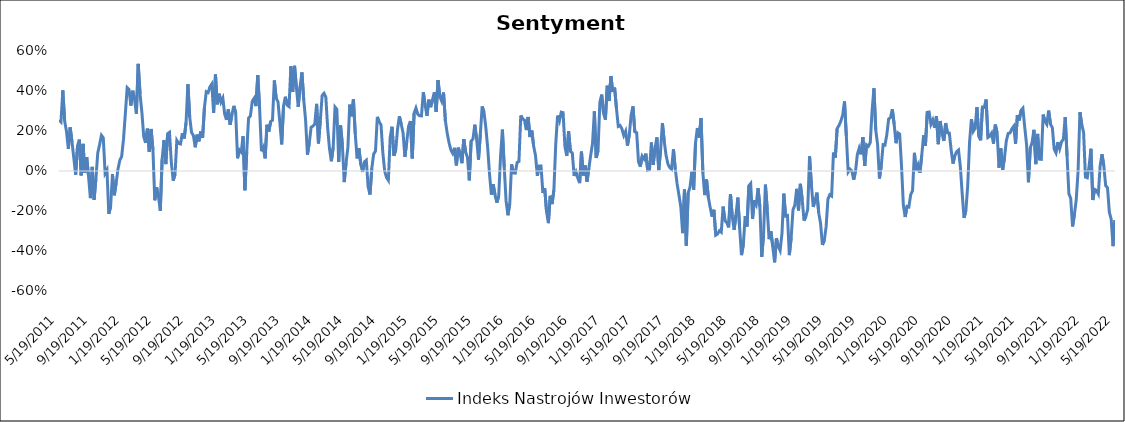
| Category | Indeks Nastrojów Inwestorów |
|---|---|
| 5/19/11 | 0.255 |
| 5/26/11 | 0.245 |
| 6/2/11 | 0.403 |
| 6/9/11 | 0.25 |
| 6/16/11 | 0.199 |
| 6/23/11 | 0.11 |
| 6/30/11 | 0.218 |
| 7/7/11 | 0.145 |
| 7/14/11 | 0.063 |
| 7/21/11 | -0.019 |
| 7/28/11 | 0.125 |
| 8/4/11 | 0.157 |
| 8/11/11 | -0.022 |
| 8/18/11 | 0.136 |
| 8/25/11 | -0.008 |
| 9/1/11 | 0.07 |
| 9/8/11 | -0.028 |
| 9/15/11 | -0.136 |
| 9/22/11 | 0.02 |
| 9/29/11 | -0.144 |
| 10/6/11 | -0.038 |
| 10/13/11 | 0.09 |
| 10/20/11 | 0.132 |
| 10/27/11 | 0.179 |
| 11/3/11 | 0.167 |
| 11/10/11 | -0.012 |
| 11/17/11 | 0.005 |
| 11/24/11 | -0.214 |
| 12/1/11 | -0.177 |
| 12/8/11 | -0.016 |
| 12/15/11 | -0.121 |
| 12/22/11 | -0.06 |
| 12/29/11 | 0.01 |
| 1/5/12 | 0.054 |
| 1/12/12 | 0.073 |
| 1/19/12 | 0.159 |
| 1/26/12 | 0.287 |
| 2/2/12 | 0.417 |
| 2/9/12 | 0.408 |
| 2/16/12 | 0.327 |
| 2/23/12 | 0.402 |
| 3/1/12 | 0.357 |
| 3/8/12 | 0.287 |
| 3/15/12 | 0.536 |
| 3/22/12 | 0.384 |
| 3/29/12 | 0.294 |
| 4/5/12 | 0.172 |
| 4/12/12 | 0.141 |
| 4/19/12 | 0.212 |
| 4/26/12 | 0.096 |
| 5/3/12 | 0.21 |
| 5/10/12 | 0.107 |
| 5/17/12 | -0.146 |
| 5/24/12 | -0.081 |
| 5/31/12 | -0.128 |
| 6/7/12 | -0.198 |
| 6/14/12 | 0.058 |
| 6/21/12 | 0.154 |
| 6/28/12 | 0.034 |
| 7/5/12 | 0.187 |
| 7/12/12 | 0.193 |
| 7/19/12 | 0.042 |
| 7/26/12 | -0.048 |
| 8/2/12 | -0.017 |
| 8/9/12 | 0.153 |
| 8/16/12 | 0.138 |
| 8/23/12 | 0.135 |
| 8/30/12 | 0.189 |
| 9/6/12 | 0.163 |
| 9/13/12 | 0.241 |
| 9/20/12 | 0.434 |
| 9/27/12 | 0.27 |
| 10/4/12 | 0.193 |
| 10/11/12 | 0.177 |
| 10/18/12 | 0.119 |
| 10/25/12 | 0.182 |
| 11/1/12 | 0.148 |
| 11/8/12 | 0.198 |
| 11/15/12 | 0.166 |
| 11/22/12 | 0.317 |
| 11/29/12 | 0.396 |
| 12/6/12 | 0.392 |
| 12/13/12 | 0.421 |
| 12/20/12 | 0.435 |
| 12/27/12 | 0.29 |
| 1/3/13 | 0.482 |
| 1/10/13 | 0.333 |
| 1/17/13 | 0.386 |
| 1/24/13 | 0.344 |
| 1/31/13 | 0.365 |
| 2/7/13 | 0.285 |
| 2/14/13 | 0.256 |
| 2/21/13 | 0.308 |
| 2/28/13 | 0.231 |
| 3/7/13 | 0.285 |
| 3/14/13 | 0.326 |
| 3/21/13 | 0.29 |
| 3/28/13 | 0.063 |
| 4/4/13 | 0.105 |
| 4/11/13 | 0.094 |
| 4/18/13 | 0.174 |
| 4/25/13 | -0.096 |
| 5/2/13 | 0.097 |
| 5/9/13 | 0.264 |
| 5/16/13 | 0.276 |
| 5/23/13 | 0.349 |
| 5/30/13 | 0.364 |
| 6/6/13 | 0.324 |
| 6/13/13 | 0.48 |
| 6/20/13 | 0.313 |
| 6/27/13 | 0.099 |
| 7/4/13 | 0.118 |
| 7/11/13 | 0.063 |
| 7/18/13 | 0.231 |
| 7/25/13 | 0.197 |
| 8/1/13 | 0.247 |
| 8/8/13 | 0.254 |
| 8/15/13 | 0.453 |
| 8/22/13 | 0.364 |
| 8/29/13 | 0.346 |
| 9/5/13 | 0.243 |
| 9/12/13 | 0.133 |
| 9/19/13 | 0.326 |
| 9/26/13 | 0.371 |
| 10/3/13 | 0.329 |
| 10/10/13 | 0.322 |
| 10/17/13 | 0.523 |
| 10/24/13 | 0.396 |
| 10/31/13 | 0.526 |
| 11/7/13 | 0.418 |
| 11/14/13 | 0.321 |
| 11/21/13 | 0.422 |
| 11/28/13 | 0.493 |
| 12/5/13 | 0.355 |
| 12/12/13 | 0.255 |
| 12/19/13 | 0.081 |
| 12/26/13 | 0.14 |
| 1/2/14 | 0.219 |
| 1/9/14 | 0.224 |
| 1/16/14 | 0.234 |
| 1/23/14 | 0.336 |
| 1/30/14 | 0.138 |
| 2/6/14 | 0.253 |
| 2/13/14 | 0.377 |
| 2/20/14 | 0.388 |
| 2/27/14 | 0.37 |
| 3/6/14 | 0.215 |
| 3/13/14 | 0.112 |
| 3/20/14 | 0.049 |
| 3/27/14 | 0.118 |
| 4/3/14 | 0.32 |
| 4/10/14 | 0.309 |
| 4/17/14 | 0.045 |
| 4/24/14 | 0.229 |
| 5/1/14 | 0.131 |
| 5/8/14 | -0.055 |
| 5/15/14 | 0.04 |
| 5/22/14 | 0.118 |
| 5/29/14 | 0.332 |
| 6/5/14 | 0.273 |
| 6/12/14 | 0.358 |
| 6/19/14 | 0.186 |
| 6/26/14 | 0.063 |
| 7/3/14 | 0.114 |
| 7/10/14 | 0.033 |
| 7/17/14 | -0.005 |
| 7/24/14 | 0.046 |
| 7/31/14 | 0.054 |
| 8/7/14 | -0.079 |
| 8/14/14 | -0.118 |
| 8/21/14 | 0.013 |
| 8/28/14 | 0.085 |
| 9/4/14 | 0.1 |
| 9/11/14 | 0.271 |
| 9/18/14 | 0.245 |
| 9/25/14 | 0.231 |
| 10/2/14 | 0.092 |
| 10/9/14 | 0 |
| 10/16/14 | -0.033 |
| 10/23/14 | -0.047 |
| 10/30/14 | 0.169 |
| 11/6/14 | 0.221 |
| 11/13/14 | 0.076 |
| 11/20/14 | 0.104 |
| 11/27/14 | 0.209 |
| 12/4/14 | 0.274 |
| 12/11/14 | 0.233 |
| 12/18/14 | 0.19 |
| 12/25/14 | 0.07 |
| 1/1/15 | 0.147 |
| 1/8/15 | 0.224 |
| 1/15/15 | 0.25 |
| 1/22/15 | 0.063 |
| 1/29/15 | 0.289 |
| 2/5/15 | 0.315 |
| 2/12/15 | 0.284 |
| 2/19/15 | 0.276 |
| 2/26/15 | 0.276 |
| 3/5/15 | 0.394 |
| 3/12/15 | 0.329 |
| 3/19/15 | 0.276 |
| 3/26/15 | 0.357 |
| 4/2/15 | 0.319 |
| 4/9/15 | 0.357 |
| 4/16/15 | 0.394 |
| 4/23/15 | 0.295 |
| 4/30/15 | 0.454 |
| 5/7/15 | 0.372 |
| 5/14/15 | 0.349 |
| 5/21/15 | 0.393 |
| 5/28/15 | 0.252 |
| 6/4/15 | 0.188 |
| 6/11/15 | 0.141 |
| 6/18/15 | 0.105 |
| 6/25/15 | 0.088 |
| 7/2/15 | 0.116 |
| 7/9/15 | 0.028 |
| 7/16/15 | 0.117 |
| 7/23/15 | 0.087 |
| 7/30/15 | 0.039 |
| 8/6/15 | 0.159 |
| 8/13/15 | 0.095 |
| 8/20/15 | 0.068 |
| 8/27/15 | -0.047 |
| 9/3/15 | 0.15 |
| 9/10/15 | 0.16 |
| 9/17/15 | 0.231 |
| 9/24/15 | 0.159 |
| 10/1/15 | 0.057 |
| 10/8/15 | 0.183 |
| 10/15/15 | 0.323 |
| 10/22/15 | 0.294 |
| 10/29/15 | 0.217 |
| 11/5/15 | 0.116 |
| 11/12/15 | -0.015 |
| 11/19/15 | -0.118 |
| 11/26/15 | -0.066 |
| 12/3/15 | -0.12 |
| 12/10/15 | -0.159 |
| 12/17/15 | -0.125 |
| 12/24/15 | 0.074 |
| 12/31/15 | 0.207 |
| 1/7/16 | 0.02 |
| 1/14/16 | -0.149 |
| 1/21/16 | -0.221 |
| 1/28/16 | -0.164 |
| 2/4/16 | 0.033 |
| 2/11/16 | -0.01 |
| 2/18/16 | -0.011 |
| 2/25/16 | 0.043 |
| 3/3/16 | 0.048 |
| 3/10/16 | 0.278 |
| 3/17/16 | 0.259 |
| 3/24/16 | 0.255 |
| 3/31/16 | 0.205 |
| 4/7/16 | 0.27 |
| 4/14/16 | 0.17 |
| 4/21/16 | 0.203 |
| 4/28/16 | 0.124 |
| 5/5/16 | 0.078 |
| 5/12/16 | -0.024 |
| 5/19/16 | 0.025 |
| 5/26/16 | 0.025 |
| 6/2/16 | -0.109 |
| 6/9/16 | -0.087 |
| 6/16/16 | -0.202 |
| 6/23/16 | -0.261 |
| 6/30/16 | -0.124 |
| 7/7/16 | -0.165 |
| 7/14/16 | -0.094 |
| 7/21/16 | 0.135 |
| 7/28/16 | 0.277 |
| 8/4/16 | 0.25 |
| 8/11/16 | 0.294 |
| 8/18/16 | 0.292 |
| 8/25/16 | 0.122 |
| 9/1/16 | 0.075 |
| 9/8/16 | 0.198 |
| 9/15/16 | 0.098 |
| 9/22/16 | 0.09 |
| 9/29/16 | -0.024 |
| 10/6/16 | -0.004 |
| 10/13/16 | -0.035 |
| 10/20/16 | -0.06 |
| 10/27/16 | 0.097 |
| 11/3/16 | -0.023 |
| 11/10/16 | 0.028 |
| 11/17/16 | -0.054 |
| 11/24/16 | 0.013 |
| 12/1/16 | 0.078 |
| 12/8/16 | 0.137 |
| 12/15/16 | 0.298 |
| 12/22/16 | 0.065 |
| 12/29/16 | 0.102 |
| 1/5/17 | 0.344 |
| 1/12/17 | 0.382 |
| 1/19/17 | 0.289 |
| 1/26/17 | 0.257 |
| 2/2/17 | 0.426 |
| 2/9/17 | 0.35 |
| 2/16/17 | 0.475 |
| 2/23/17 | 0.396 |
| 3/2/17 | 0.417 |
| 3/9/17 | 0.315 |
| 3/16/17 | 0.223 |
| 3/23/17 | 0.228 |
| 3/30/17 | 0.21 |
| 4/6/17 | 0.178 |
| 4/13/17 | 0.199 |
| 4/20/17 | 0.127 |
| 4/27/17 | 0.182 |
| 5/4/17 | 0.28 |
| 5/11/17 | 0.323 |
| 5/18/17 | 0.196 |
| 5/25/17 | 0.191 |
| 6/1/17 | 0.047 |
| 6/8/17 | 0.022 |
| 6/15/17 | 0.074 |
| 6/22/17 | 0.06 |
| 6/29/17 | 0.087 |
| 7/6/17 | 0.004 |
| 7/13/17 | 0.007 |
| 7/20/17 | 0.142 |
| 7/27/17 | 0.031 |
| 8/3/17 | 0.114 |
| 8/10/17 | 0.168 |
| 8/17/17 | 0.005 |
| 8/24/17 | 0.102 |
| 8/31/17 | 0.24 |
| 9/7/17 | 0.148 |
| 9/14/17 | 0.078 |
| 9/21/17 | 0.036 |
| 9/28/17 | 0.017 |
| 10/5/17 | 0.008 |
| 10/12/17 | 0.108 |
| 10/19/17 | 0.009 |
| 10/26/17 | -0.065 |
| 11/2/17 | -0.12 |
| 11/9/17 | -0.18 |
| 11/16/17 | -0.311 |
| 11/23/17 | -0.093 |
| 11/30/17 | -0.373 |
| 12/7/17 | -0.11 |
| 12/14/17 | -0.081 |
| 12/21/17 | -0.004 |
| 12/28/17 | -0.093 |
| 1/4/18 | 0.141 |
| 1/11/18 | 0.215 |
| 1/18/18 | 0.167 |
| 1/25/18 | 0.264 |
| 2/1/18 | -0.009 |
| 2/8/18 | -0.12 |
| 2/15/18 | -0.043 |
| 2/22/18 | -0.133 |
| 3/1/18 | -0.184 |
| 3/8/18 | -0.228 |
| 3/15/18 | -0.194 |
| 3/22/18 | -0.321 |
| 3/29/18 | -0.315 |
| 4/5/18 | -0.299 |
| 4/12/18 | -0.306 |
| 4/19/18 | -0.178 |
| 4/26/18 | -0.248 |
| 5/3/18 | -0.258 |
| 5/10/18 | -0.282 |
| 5/17/18 | -0.116 |
| 5/24/18 | -0.23 |
| 5/31/18 | -0.295 |
| 6/7/18 | -0.22 |
| 6/14/18 | -0.133 |
| 6/21/18 | -0.286 |
| 6/28/18 | -0.421 |
| 7/5/18 | -0.368 |
| 7/12/18 | -0.226 |
| 7/19/18 | -0.278 |
| 7/26/18 | -0.075 |
| 8/2/18 | -0.063 |
| 8/9/18 | -0.24 |
| 8/16/18 | -0.147 |
| 8/23/18 | -0.167 |
| 8/30/18 | -0.086 |
| 9/6/18 | -0.178 |
| 9/13/18 | -0.43 |
| 9/20/18 | -0.317 |
| 9/27/18 | -0.068 |
| 10/4/18 | -0.192 |
| 10/11/18 | -0.341 |
| 10/18/18 | -0.302 |
| 10/25/18 | -0.379 |
| 11/1/18 | -0.457 |
| 11/8/18 | -0.336 |
| 11/15/18 | -0.378 |
| 11/22/18 | -0.398 |
| 11/29/18 | -0.313 |
| 12/6/18 | -0.113 |
| 12/13/18 | -0.225 |
| 12/20/18 | -0.223 |
| 12/27/18 | -0.421 |
| 1/3/19 | -0.335 |
| 1/10/19 | -0.194 |
| 1/17/19 | -0.17 |
| 1/24/19 | -0.089 |
| 1/31/19 | -0.197 |
| 2/7/19 | -0.064 |
| 2/14/19 | -0.142 |
| 2/21/19 | -0.248 |
| 2/28/19 | -0.228 |
| 3/7/19 | -0.191 |
| 3/14/19 | 0.073 |
| 3/21/19 | -0.069 |
| 3/28/19 | -0.18 |
| 4/4/19 | -0.147 |
| 4/11/19 | -0.108 |
| 4/18/19 | -0.211 |
| 4/25/19 | -0.263 |
| 5/2/19 | -0.369 |
| 5/9/19 | -0.348 |
| 5/16/19 | -0.28 |
| 5/23/19 | -0.141 |
| 5/30/19 | -0.119 |
| 6/6/19 | -0.125 |
| 6/13/19 | 0.092 |
| 6/20/19 | 0.067 |
| 6/27/19 | 0.212 |
| 7/4/19 | 0.228 |
| 7/11/19 | 0.249 |
| 7/18/19 | 0.279 |
| 7/25/19 | 0.348 |
| 8/1/19 | 0.175 |
| 8/8/19 | -0.005 |
| 8/15/19 | 0.009 |
| 8/22/19 | 0 |
| 8/29/19 | -0.043 |
| 9/5/19 | 0 |
| 9/12/19 | 0.083 |
| 9/19/19 | 0.114 |
| 9/26/19 | 0.083 |
| 10/3/19 | 0.169 |
| 10/10/19 | 0.026 |
| 10/17/19 | 0.131 |
| 10/24/19 | 0.124 |
| 10/31/19 | 0.142 |
| 11/7/19 | 0.301 |
| 11/14/19 | 0.414 |
| 11/21/19 | 0.205 |
| 11/28/19 | 0.132 |
| 12/5/19 | -0.037 |
| 12/12/19 | 0.027 |
| 12/19/19 | 0.132 |
| 12/26/19 | 0.129 |
| 1/2/20 | 0.181 |
| 1/9/20 | 0.26 |
| 1/16/20 | 0.266 |
| 1/23/20 | 0.309 |
| 1/30/20 | 0.234 |
| 2/6/20 | 0.139 |
| 2/13/20 | 0.191 |
| 2/20/20 | 0.185 |
| 2/27/20 | 0.026 |
| 3/5/20 | -0.17 |
| 3/12/20 | -0.23 |
| 3/19/20 | -0.177 |
| 3/26/20 | -0.18 |
| 4/2/20 | -0.118 |
| 4/9/20 | -0.098 |
| 4/16/20 | 0.091 |
| 4/23/20 | 0 |
| 4/30/20 | 0.029 |
| 5/7/20 | -0.009 |
| 5/14/20 | 0.078 |
| 5/21/20 | 0.179 |
| 5/28/20 | 0.127 |
| 6/4/20 | 0.293 |
| 6/11/20 | 0.295 |
| 6/18/20 | 0.233 |
| 6/25/20 | 0.255 |
| 7/2/20 | 0.216 |
| 7/9/20 | 0.273 |
| 7/16/20 | 0.134 |
| 7/23/20 | 0.25 |
| 7/30/20 | 0.189 |
| 8/6/20 | 0.15 |
| 8/13/20 | 0.24 |
| 8/20/20 | 0.19 |
| 8/27/20 | 0.189 |
| 9/3/20 | 0.104 |
| 9/10/20 | 0.037 |
| 9/17/20 | 0.077 |
| 9/24/20 | 0.097 |
| 10/1/20 | 0.105 |
| 10/8/20 | 0.02 |
| 10/15/20 | -0.114 |
| 10/22/20 | -0.234 |
| 10/29/20 | -0.198 |
| 11/5/20 | -0.072 |
| 11/12/20 | 0.144 |
| 11/19/20 | 0.259 |
| 11/26/20 | 0.198 |
| 12/3/20 | 0.213 |
| 12/10/20 | 0.319 |
| 12/17/20 | 0.175 |
| 12/24/20 | 0.153 |
| 12/31/20 | 0.32 |
| 1/7/21 | 0.318 |
| 1/14/21 | 0.358 |
| 1/21/21 | 0.168 |
| 1/28/21 | 0.174 |
| 2/4/21 | 0.189 |
| 2/11/21 | 0.136 |
| 2/18/21 | 0.232 |
| 2/25/21 | 0.19 |
| 3/4/21 | 0.017 |
| 3/11/21 | 0.113 |
| 3/18/21 | 0.006 |
| 3/25/21 | 0.067 |
| 4/1/21 | 0.152 |
| 4/8/21 | 0.188 |
| 4/15/21 | 0.19 |
| 4/22/21 | 0.211 |
| 4/29/21 | 0.224 |
| 5/6/21 | 0.135 |
| 5/13/21 | 0.28 |
| 5/20/21 | 0.253 |
| 5/27/21 | 0.303 |
| 6/3/21 | 0.314 |
| 6/10/21 | 0.219 |
| 6/17/21 | 0.132 |
| 6/24/21 | -0.056 |
| 7/1/21 | 0.115 |
| 7/8/21 | 0.143 |
| 7/15/21 | 0.206 |
| 7/22/21 | 0.035 |
| 7/29/21 | 0.185 |
| 8/5/21 | 0.059 |
| 8/12/21 | 0.058 |
| 8/19/21 | 0.282 |
| 8/26/21 | 0.248 |
| 9/2/21 | 0.234 |
| 9/9/21 | 0.302 |
| 9/16/21 | 0.234 |
| 9/23/21 | 0.217 |
| 9/30/21 | 0.109 |
| 10/7/21 | 0.091 |
| 10/14/21 | 0.145 |
| 10/21/21 | 0.111 |
| 10/28/21 | 0.146 |
| 11/4/21 | 0.159 |
| 11/11/21 | 0.27 |
| 11/18/21 | 0.076 |
| 11/25/21 | -0.113 |
| 12/2/21 | -0.138 |
| 12/9/21 | -0.277 |
| 12/16/21 | -0.218 |
| 12/23/21 | -0.143 |
| 12/30/21 | 0 |
| 1/6/22 | 0.294 |
| 1/13/22 | 0.233 |
| 1/20/22 | 0.192 |
| 1/27/22 | -0.03 |
| 2/3/22 | -0.034 |
| 2/10/22 | 0.026 |
| 2/17/22 | 0.111 |
| 2/24/22 | -0.145 |
| 3/3/22 | -0.092 |
| 3/10/22 | -0.097 |
| 3/17/22 | -0.115 |
| 3/24/22 | 0.026 |
| 3/31/22 | 0.084 |
| 4/7/22 | 0.026 |
| 4/14/22 | -0.073 |
| 4/21/22 | -0.084 |
| 4/28/22 | -0.206 |
| 5/5/22 | -0.241 |
| 5/12/22 | -0.376 |
| 5/19/22 | -0.246 |